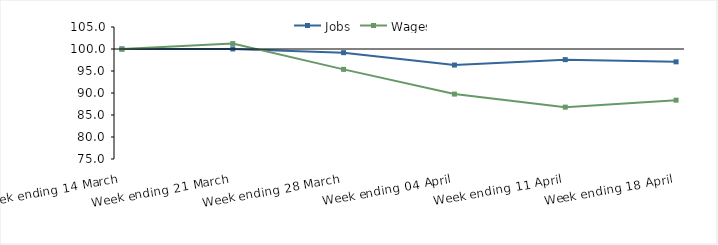
| Category | Jobs | Wages |
|---|---|---|
| 0 | 100 | 100 |
| 1900-01-01 | 100.014 | 101.226 |
| 1900-01-02 | 99.165 | 95.372 |
| 1900-01-03 | 96.355 | 89.754 |
| 1900-01-04 | 97.578 | 86.79 |
| 1900-01-05 | 97.084 | 88.367 |